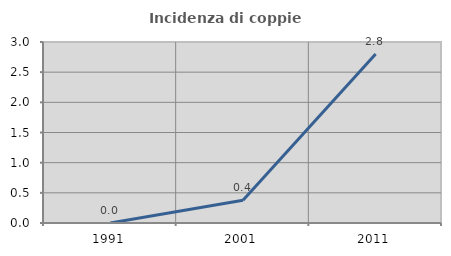
| Category | Incidenza di coppie miste |
|---|---|
| 1991.0 | 0 |
| 2001.0 | 0.377 |
| 2011.0 | 2.8 |